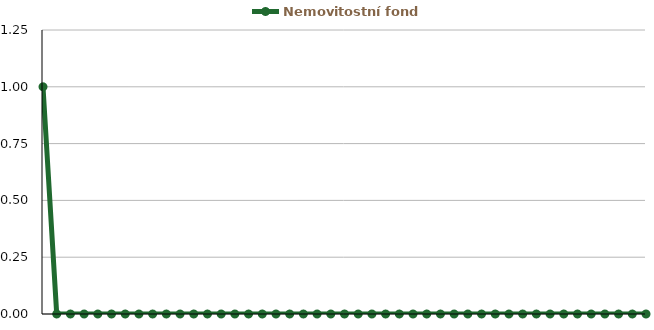
| Category | Nemovitostní fond |
|---|---|
| 0 | 1 |
| 1 | 0 |
| 2 | 0 |
| 3 | 0 |
| 4 | 0 |
| 5 | 0 |
| 6 | 0 |
| 7 | 0 |
| 8 | 0 |
| 9 | 0 |
| 10 | 0 |
| 11 | 0 |
| 12 | 0 |
| 13 | 0 |
| 14 | 0 |
| 15 | 0 |
| 16 | 0 |
| 17 | 0 |
| 18 | 0 |
| 19 | 0 |
| 20 | 0 |
| 21 | 0 |
| 22 | 0 |
| 23 | 0 |
| 24 | 0 |
| 25 | 0 |
| 26 | 0 |
| 27 | 0 |
| 28 | 0 |
| 29 | 0 |
| 30 | 0 |
| 31 | 0 |
| 32 | 0 |
| 33 | 0 |
| 34 | 0 |
| 35 | 0 |
| 36 | 0 |
| 37 | 0 |
| 38 | 0 |
| 39 | 0 |
| 40 | 0 |
| 41 | 0 |
| 42 | 0 |
| 43 | 0 |
| 44 | 0 |